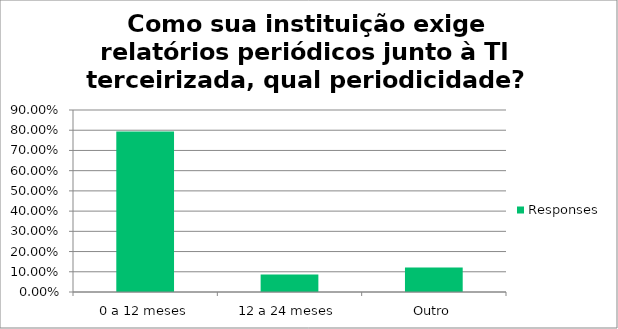
| Category | Responses |
|---|---|
| 0 a 12 meses | 0.793 |
| 12 a 24 meses | 0.086 |
| Outro | 0.121 |